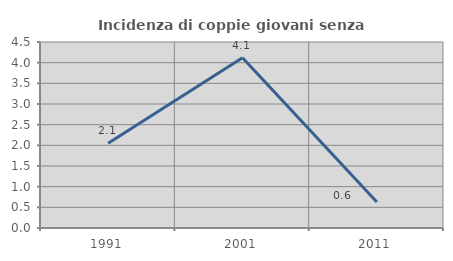
| Category | Incidenza di coppie giovani senza figli |
|---|---|
| 1991.0 | 2.051 |
| 2001.0 | 4.118 |
| 2011.0 | 0.629 |